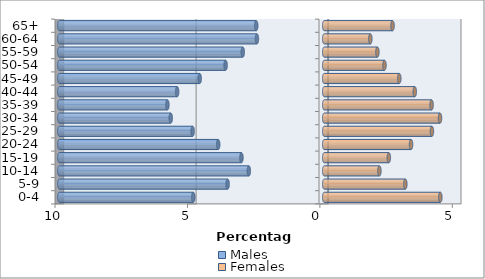
| Category | Males | Females |
|---|---|---|
| 0-4 | -4.943 | 4.384 |
| 5-9 | -3.647 | 3.062 |
| 10-14 | -2.846 | 2.084 |
| 15-19 | -3.126 | 2.44 |
| 20-24 | -4.003 | 3.278 |
| 25-29 | -4.968 | 4.066 |
| 30-34 | -5.794 | 4.371 |
| 35-39 | -5.921 | 4.053 |
| 40-44 | -5.553 | 3.418 |
| 45-49 | -4.701 | 2.834 |
| 50-54 | -3.723 | 2.274 |
| 55-59 | -3.075 | 2.008 |
| 60-64 | -2.541 | 1.741 |
| 65+ | -2.567 | 2.579 |